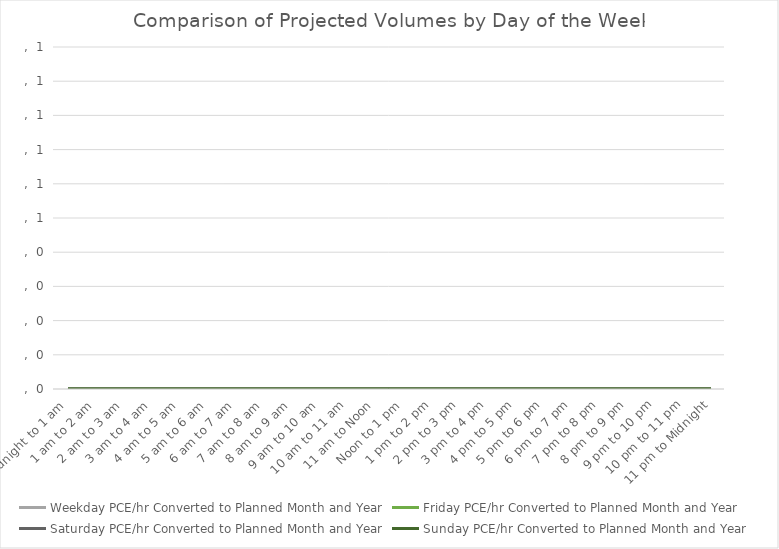
| Category | Weekday | Friday | Saturday | Sunday |
|---|---|---|---|---|
| Midnight to 1 am | 0 | 0 | 0 | 0 |
| 1 am to 2 am | 0 | 0 | 0 | 0 |
| 2 am to 3 am | 0 | 0 | 0 | 0 |
| 3 am to 4 am | 0 | 0 | 0 | 0 |
| 4 am to 5 am | 0 | 0 | 0 | 0 |
| 5 am to 6 am | 0 | 0 | 0 | 0 |
| 6 am to 7 am | 0 | 0 | 0 | 0 |
| 7 am to 8 am | 0 | 0 | 0 | 0 |
| 8 am to 9 am | 0 | 0 | 0 | 0 |
| 9 am to 10 am | 0 | 0 | 0 | 0 |
| 10 am to 11 am | 0 | 0 | 0 | 0 |
| 11 am to Noon | 0 | 0 | 0 | 0 |
| Noon to 1 pm | 0 | 0 | 0 | 0 |
| 1 pm to 2 pm | 0 | 0 | 0 | 0 |
| 2 pm to 3 pm | 0 | 0 | 0 | 0 |
| 3 pm to 4 pm | 0 | 0 | 0 | 0 |
| 4 pm to 5 pm | 0 | 0 | 0 | 0 |
| 5 pm to 6 pm | 0 | 0 | 0 | 0 |
| 6 pm to 7 pm | 0 | 0 | 0 | 0 |
| 7 pm to 8 pm | 0 | 0 | 0 | 0 |
| 8 pm to 9 pm | 0 | 0 | 0 | 0 |
| 9 pm to 10 pm | 0 | 0 | 0 | 0 |
| 10 pm to 11 pm | 0 | 0 | 0 | 0 |
| 11 pm to Midnight | 0 | 0 | 0 | 0 |